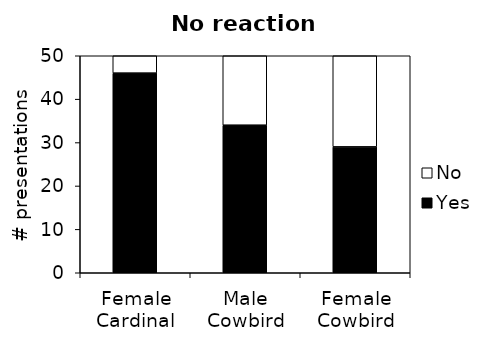
| Category | Yes | No |
|---|---|---|
| Female Cardinal | 46 | 4 |
| Male Cowbird | 34 | 16 |
| Female Cowbird | 29 | 21 |